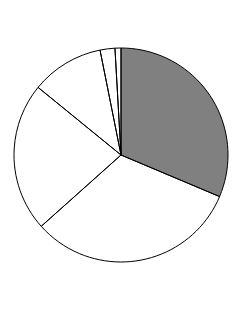
| Category | Series 0 |
|---|---|
| 0 | 31.352 |
| 1 | 32.037 |
| 2 | 22.498 |
| 3 | 10.971 |
| 4 | 2.24 |
| 5 | 0.901 |